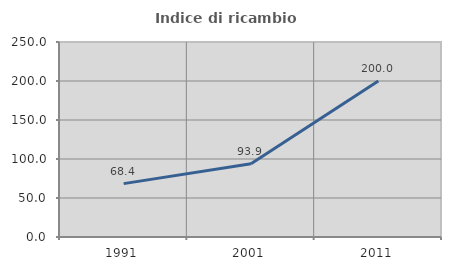
| Category | Indice di ricambio occupazionale  |
|---|---|
| 1991.0 | 68.421 |
| 2001.0 | 93.939 |
| 2011.0 | 200 |